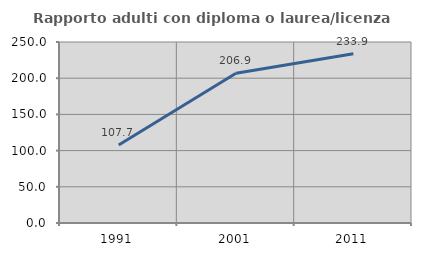
| Category | Rapporto adulti con diploma o laurea/licenza media  |
|---|---|
| 1991.0 | 107.692 |
| 2001.0 | 206.897 |
| 2011.0 | 233.898 |